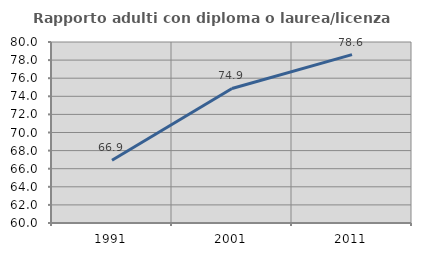
| Category | Rapporto adulti con diploma o laurea/licenza media  |
|---|---|
| 1991.0 | 66.929 |
| 2001.0 | 74.863 |
| 2011.0 | 78.603 |